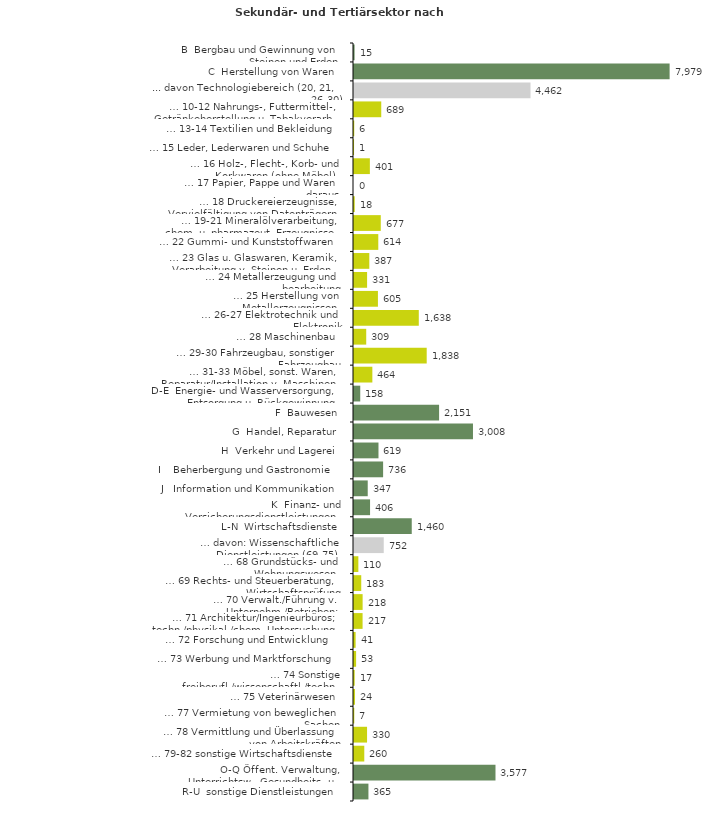
| Category | Series 0 |
|---|---|
| B  Bergbau und Gewinnung von Steinen und Erden | 15 |
| C  Herstellung von Waren | 7979 |
| ... davon Technologiebereich (20, 21, 26-30) | 4462 |
| … 10-12 Nahrungs-, Futtermittel-, Getränkeherstellung u. Tabakverarb. | 689 |
| … 13-14 Textilien und Bekleidung | 6 |
| … 15 Leder, Lederwaren und Schuhe | 1 |
| … 16 Holz-, Flecht-, Korb- und Korkwaren (ohne Möbel)  | 401 |
| … 17 Papier, Pappe und Waren daraus  | 0 |
| … 18 Druckereierzeugnisse, Vervielfältigung von Datenträgern | 18 |
| … 19-21 Mineralölverarbeitung, chem. u. pharmazeut. Erzeugnisse | 677 |
| … 22 Gummi- und Kunststoffwaren | 614 |
| … 23 Glas u. Glaswaren, Keramik, Verarbeitung v. Steinen u. Erden  | 387 |
| … 24 Metallerzeugung und -bearbeitung | 331 |
| … 25 Herstellung von Metallerzeugnissen  | 605 |
| … 26-27 Elektrotechnik und Elektronik | 1638 |
| … 28 Maschinenbau | 309 |
| … 29-30 Fahrzeugbau, sonstiger Fahrzeugbau | 1838 |
| … 31-33 Möbel, sonst. Waren, Reparatur/Installation v. Maschinen | 464 |
| D-E  Energie- und Wasserversorgung, Entsorgung u. Rückgewinnung | 158 |
| F  Bauwesen | 2151 |
| G  Handel, Reparatur | 3008 |
| H  Verkehr und Lagerei | 619 |
| I    Beherbergung und Gastronomie | 736 |
| J   Information und Kommunikation | 347 |
| K  Finanz- und Versicherungsdienstleistungen | 406 |
| L-N  Wirtschaftsdienste | 1460 |
| … davon: Wissenschaftliche Dienstleistungen (69-75) | 752 |
| … 68 Grundstücks- und Wohnungswesen  | 110 |
| … 69 Rechts- und Steuerberatung, Wirtschaftsprüfung | 183 |
| … 70 Verwalt./Führung v. Unternehm./Betrieben; Unternehmensberat. | 218 |
| … 71 Architektur/Ingenieurbüros; techn./physikal./chem. Untersuchung | 217 |
| … 72 Forschung und Entwicklung  | 41 |
| … 73 Werbung und Marktforschung | 53 |
| … 74 Sonstige freiberufl./wissenschaftl./techn. Tätigkeiten | 17 |
| … 75 Veterinärwesen | 24 |
| … 77 Vermietung von beweglichen Sachen  | 7 |
| … 78 Vermittlung und Überlassung von Arbeitskräften | 330 |
| … 79-82 sonstige Wirtschaftsdienste | 260 |
| O-Q Öffent. Verwaltung, Unterrichtsw., Gesundheits- u. Sozialwesen | 3577 |
| R-U  sonstige Dienstleistungen | 365 |